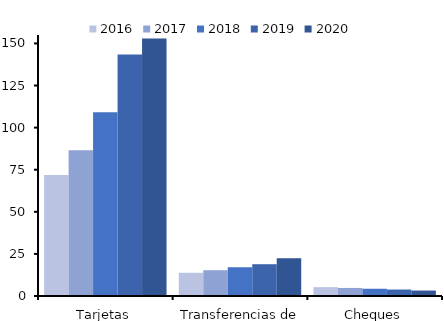
| Category | 2016 | 2017 | 2018 | 2019 | 2020 |
|---|---|---|---|---|---|
| Tarjetas | 71.904 | 86.593 | 109.178 | 143.492 | 152.862 |
| Transferencias de fondos | 13.79 | 15.313 | 17.084 | 18.887 | 22.48 |
| Cheques | 5.261 | 4.78 | 4.305 | 3.835 | 3.233 |